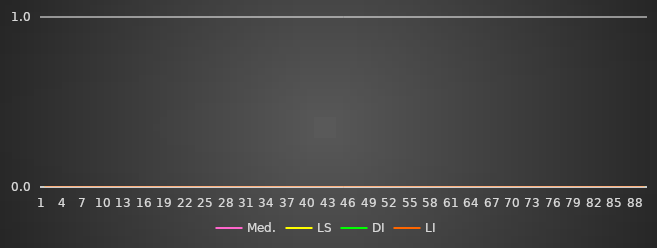
| Category | Med. | LS | DI | LI |
|---|---|---|---|---|
| 0 |  | 0 | 0 | 0 |
| 1 |  | 0 | 0 | 0 |
| 2 |  | 0 | 0 | 0 |
| 3 |  | 0 | 0 | 0 |
| 4 |  | 0 | 0 | 0 |
| 5 |  | 0 | 0 | 0 |
| 6 |  | 0 | 0 | 0 |
| 7 |  | 0 | 0 | 0 |
| 8 |  | 0 | 0 | 0 |
| 9 |  | 0 | 0 | 0 |
| 10 |  | 0 | 0 | 0 |
| 11 |  | 0 | 0 | 0 |
| 12 |  | 0 | 0 | 0 |
| 13 |  | 0 | 0 | 0 |
| 14 |  | 0 | 0 | 0 |
| 15 |  | 0 | 0 | 0 |
| 16 |  | 0 | 0 | 0 |
| 17 |  | 0 | 0 | 0 |
| 18 |  | 0 | 0 | 0 |
| 19 |  | 0 | 0 | 0 |
| 20 |  | 0 | 0 | 0 |
| 21 |  | 0 | 0 | 0 |
| 22 |  | 0 | 0 | 0 |
| 23 |  | 0 | 0 | 0 |
| 24 |  | 0 | 0 | 0 |
| 25 |  | 0 | 0 | 0 |
| 26 |  | 0 | 0 | 0 |
| 27 |  | 0 | 0 | 0 |
| 28 |  | 0 | 0 | 0 |
| 29 |  | 0 | 0 | 0 |
| 30 |  | 0 | 0 | 0 |
| 31 |  | 0 | 0 | 0 |
| 32 |  | 0 | 0 | 0 |
| 33 |  | 0 | 0 | 0 |
| 34 |  | 0 | 0 | 0 |
| 35 |  | 0 | 0 | 0 |
| 36 |  | 0 | 0 | 0 |
| 37 |  | 0 | 0 | 0 |
| 38 |  | 0 | 0 | 0 |
| 39 |  | 0 | 0 | 0 |
| 40 |  | 0 | 0 | 0 |
| 41 |  | 0 | 0 | 0 |
| 42 |  | 0 | 0 | 0 |
| 43 |  | 0 | 0 | 0 |
| 44 |  | 0 | 0 | 0 |
| 45 |  | 0 | 0 | 0 |
| 46 |  | 0 | 0 | 0 |
| 47 |  | 0 | 0 | 0 |
| 48 |  | 0 | 0 | 0 |
| 49 |  | 0 | 0 | 0 |
| 50 |  | 0 | 0 | 0 |
| 51 |  | 0 | 0 | 0 |
| 52 |  | 0 | 0 | 0 |
| 53 |  | 0 | 0 | 0 |
| 54 |  | 0 | 0 | 0 |
| 55 |  | 0 | 0 | 0 |
| 56 |  | 0 | 0 | 0 |
| 57 |  | 0 | 0 | 0 |
| 58 |  | 0 | 0 | 0 |
| 59 |  | 0 | 0 | 0 |
| 60 |  | 0 | 0 | 0 |
| 61 |  | 0 | 0 | 0 |
| 62 |  | 0 | 0 | 0 |
| 63 |  | 0 | 0 | 0 |
| 64 |  | 0 | 0 | 0 |
| 65 |  | 0 | 0 | 0 |
| 66 |  | 0 | 0 | 0 |
| 67 |  | 0 | 0 | 0 |
| 68 |  | 0 | 0 | 0 |
| 69 |  | 0 | 0 | 0 |
| 70 |  | 0 | 0 | 0 |
| 71 |  | 0 | 0 | 0 |
| 72 |  | 0 | 0 | 0 |
| 73 |  | 0 | 0 | 0 |
| 74 |  | 0 | 0 | 0 |
| 75 |  | 0 | 0 | 0 |
| 76 |  | 0 | 0 | 0 |
| 77 |  | 0 | 0 | 0 |
| 78 |  | 0 | 0 | 0 |
| 79 |  | 0 | 0 | 0 |
| 80 |  | 0 | 0 | 0 |
| 81 |  | 0 | 0 | 0 |
| 82 |  | 0 | 0 | 0 |
| 83 |  | 0 | 0 | 0 |
| 84 |  | 0 | 0 | 0 |
| 85 |  | 0 | 0 | 0 |
| 86 |  | 0 | 0 | 0 |
| 87 |  | 0 | 0 | 0 |
| 88 |  | 0 | 0 | 0 |